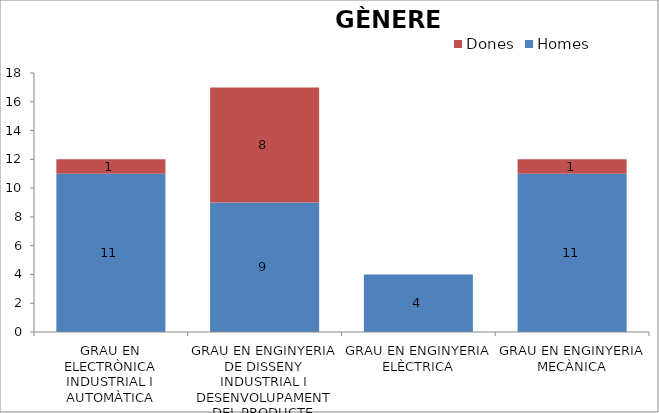
| Category | Homes | Dones |
|---|---|---|
| GRAU EN ELECTRÒNICA INDUSTRIAL I AUTOMÀTICA | 11 | 1 |
| GRAU EN ENGINYERIA DE DISSENY INDUSTRIAL I DESENVOLUPAMENT DEL PRODUCTE | 9 | 8 |
| GRAU EN ENGINYERIA ELÈCTRICA | 4 | 0 |
| GRAU EN ENGINYERIA MECÀNICA | 11 | 1 |